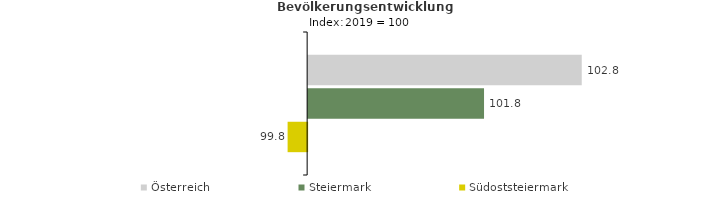
| Category | Österreich | Steiermark | Südoststeiermark |
|---|---|---|---|
| 2023.0 | 102.8 | 101.8 | 99.8 |